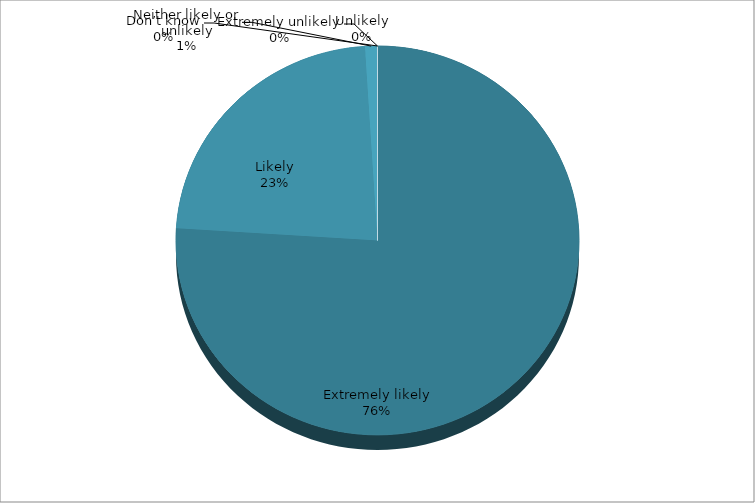
| Category | Series 0 |
|---|---|
| Extremely likely | 76 |
| Likely | 23 |
| Neither likely or unlikely | 1 |
| Unlikely | 0 |
| Extremely unlikely | 0 |
| Don’t know | 0 |